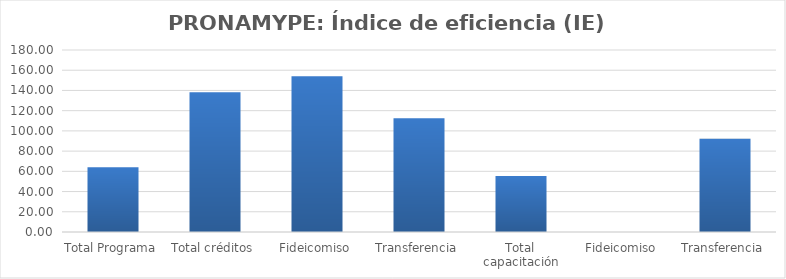
| Category | Índice de eficiencia (IE)  |
|---|---|
| Total Programa | 64.154 |
| Total créditos | 138.209 |
| Fideicomiso | 154.099 |
| Transferencia | 112.568 |
| Total capacitación | 55.273 |
| Fideicomiso | 0 |
| Transferencia | 92.121 |